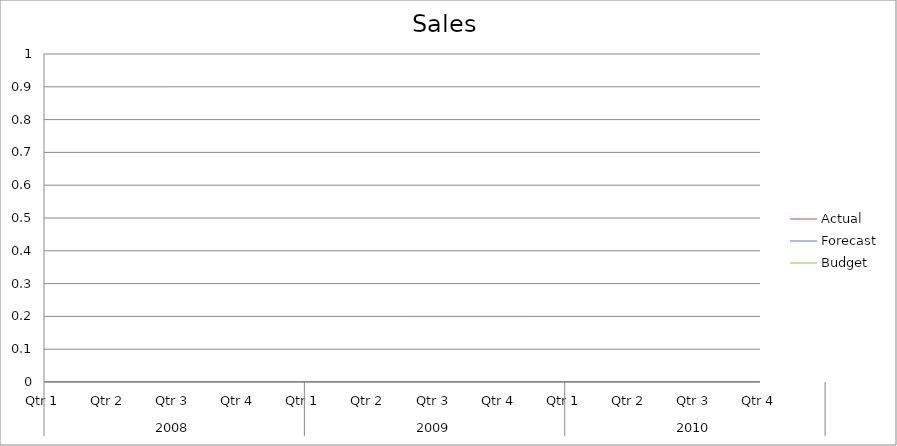
| Category | Budget | Forecast | Actual |
|---|---|---|---|
| 0 | 1900 | 2940 | 2390 |
| 1 | 2690 | 1120 | 950 |
| 2 | 2370 | 1590 | 2240 |
| 3 | 3280 | 3340 | 1680 |
| 4 | 1160 | 1520 | 940 |
| 5 | 3100 | 2510 | 500 |
| 6 | 1430 | 790 | 830 |
| 7 | 2330 | 850 | 1040 |
| 8 | 2410 | 980 | 2090 |
| 9 | 1150 | 3220 | 2670 |
| 10 | 2400 | 750 | 920 |
| 11 | 2770 | 1750 | 1390 |